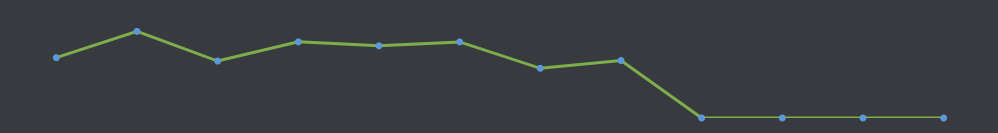
| Category | Numerar disponibil |
|---|---|
| IAN | 820 |
| FEB | 1177 |
| MAR | 774 |
| APR | 1035 |
| MAI | 981 |
| IUN | 1034 |
| IUL | 675 |
| AUG | 781 |
| SEP | 0 |
| OCT | 0 |
| NOV | 0 |
| DEC | 0 |